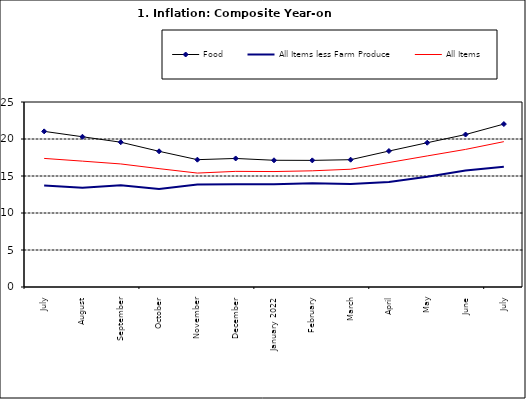
| Category | Food | All Items less Farm Produce | All Items |
|---|---|---|---|
| July | 21.032 | 13.72 | 17.377 |
| August | 20.303 | 13.408 | 17.009 |
| September | 19.566 | 13.745 | 16.63 |
| October | 18.338 | 13.24 | 15.994 |
| November | 17.209 | 13.851 | 15.396 |
| December | 17.37 | 13.873 | 15.625 |
| January 2022 | 17.126 | 13.869 | 15.601 |
| February | 17.11 | 14.011 | 15.702 |
| March | 17.203 | 13.914 | 15.915 |
| April | 18.371 | 14.178 | 16.819 |
| May | 19.496 | 14.897 | 17.712 |
| June | 20.603 | 15.747 | 18.596 |
| July | 22.017 | 16.258 | 19.643 |